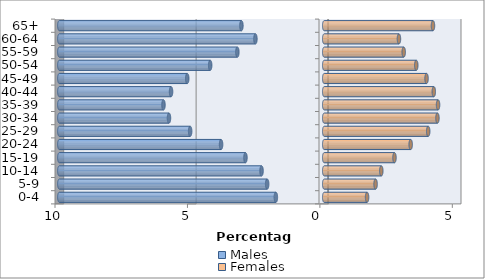
| Category | Males | Females |
|---|---|---|
| 0-4 | -1.826 | 1.618 |
| 5-9 | -2.155 | 1.939 |
| 10-14 | -2.366 | 2.155 |
| 15-19 | -2.974 | 2.652 |
| 20-24 | -3.894 | 3.264 |
| 25-29 | -5.062 | 3.926 |
| 30-34 | -5.861 | 4.274 |
| 35-39 | -6.069 | 4.298 |
| 40-44 | -5.783 | 4.137 |
| 45-49 | -5.172 | 3.863 |
| 50-54 | -4.306 | 3.475 |
| 55-59 | -3.279 | 3.001 |
| 60-64 | -2.598 | 2.821 |
| 65+ | -3.126 | 4.106 |